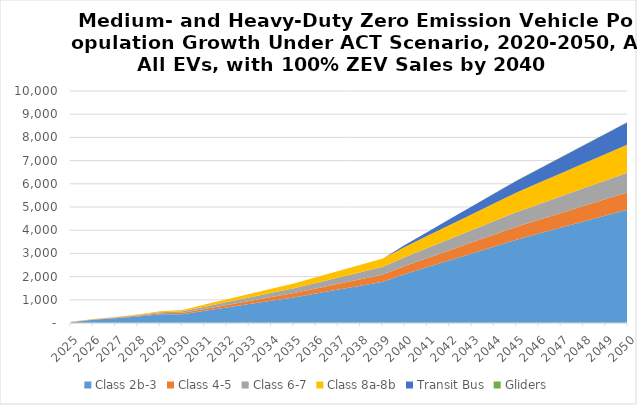
| Category | Class 2b-3 | Class 4-5 | Class 6-7 | Class 8a-8b | Transit Bus | Gliders |
|---|---|---|---|---|---|---|
| 2025.0 | 32.928 | 5.316 | 5.642 | 5.081 | 0 | 0 |
| 2026.0 | 140.458 | 11.433 | 12.284 | 10.837 | 0 | 0 |
| 2027.0 | 205.544 | 18.819 | 20.466 | 17.646 | 0 | 0 |
| 2028.0 | 283.891 | 28.83 | 31.728 | 26.147 | 0 | 0 |
| 2029.0 | 377.927 | 42.069 | 46.843 | 36.812 | 0 | 0 |
| 2030.0 | 378.082 | 60.025 | 67.61 | 59.099 | 0 | 0 |
| 2031.0 | 523.335 | 85.229 | 95.365 | 88.195 | 0 | 0 |
| 2032.0 | 668.589 | 110.433 | 123.12 | 117.292 | 0 | 0 |
| 2033.0 | 813.842 | 135.637 | 150.875 | 146.388 | 0 | 0 |
| 2034.0 | 959.095 | 160.841 | 178.63 | 175.484 | 0 | 0 |
| 2035.0 | 1104.349 | 186.044 | 206.385 | 204.58 | 0 | 0 |
| 2036.0 | 1273.093 | 216.321 | 238.98 | 243.59 | 0 | 0 |
| 2037.0 | 1441.836 | 246.598 | 271.575 | 282.599 | 0 | 0 |
| 2038.0 | 1610.58 | 276.875 | 304.171 | 321.608 | 0 | 0 |
| 2039.0 | 1779.324 | 307.152 | 336.766 | 360.618 | 0 | 0 |
| 2040.0 | 2113.175 | 351.163 | 384.448 | 441.894 | 82.023 | 0.87 |
| 2041.0 | 2409.104 | 392.875 | 433.355 | 522.574 | 167.381 | 1.724 |
| 2042.0 | 2705.032 | 434.588 | 482.263 | 603.255 | 252.739 | 2.579 |
| 2043.0 | 3000.96 | 476.3 | 531.171 | 683.936 | 338.097 | 3.434 |
| 2044.0 | 3296.889 | 518.013 | 580.079 | 764.616 | 423.455 | 4.289 |
| 2045.0 | 3592.817 | 559.725 | 628.986 | 845.297 | 508.814 | 5.144 |
| 2046.0 | 3853.36 | 596.064 | 673.273 | 919.105 | 599.55 | 5.971 |
| 2047.0 | 4113.903 | 632.403 | 717.559 | 992.913 | 690.286 | 6.798 |
| 2048.0 | 4374.446 | 668.742 | 761.845 | 1066.721 | 781.022 | 7.626 |
| 2049.0 | 4634.989 | 705.081 | 806.132 | 1140.53 | 871.758 | 8.453 |
| 2050.0 | 4895.532 | 741.42 | 850.418 | 1214.338 | 962.495 | 9.28 |